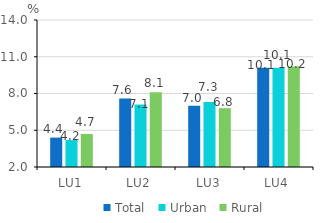
| Category | Total | Urban | Rural |
|---|---|---|---|
| LU1 | 4.4 | 4.2 | 4.7 |
| LU2 | 7.6 | 7.1 | 8.1 |
| LU3 | 7 | 7.3 | 6.8 |
| LU4 | 10.1 | 10.1 | 10.2 |